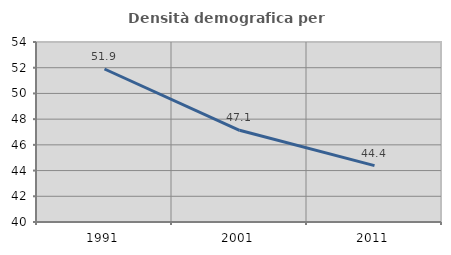
| Category | Densità demografica |
|---|---|
| 1991.0 | 51.899 |
| 2001.0 | 47.133 |
| 2011.0 | 44.388 |